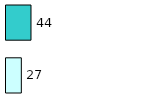
| Category | Series 0 | Series 1 |
|---|---|---|
| 0 | 27 | 44 |